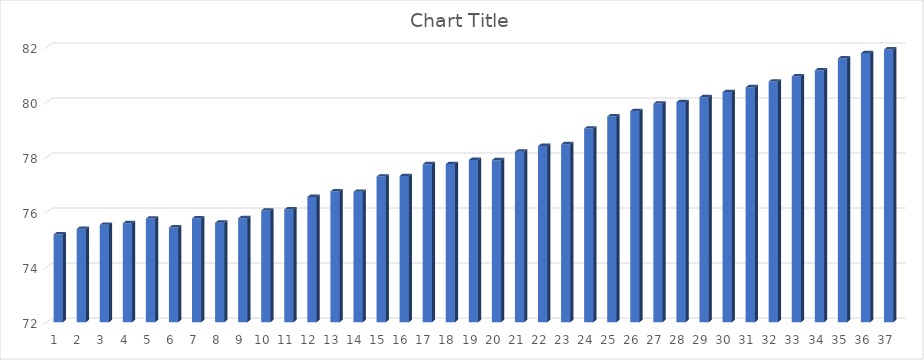
| Category | Series 0 |
|---|---|
| 0 | 75.193 |
| 1 | 75.396 |
| 2 | 75.539 |
| 3 | 75.601 |
| 4 | 75.769 |
| 5 | 75.445 |
| 6 | 75.776 |
| 7 | 75.619 |
| 8 | 75.78 |
| 9 | 76.061 |
| 10 | 76.103 |
| 11 | 76.557 |
| 12 | 76.758 |
| 13 | 76.74 |
| 14 | 77.294 |
| 15 | 77.315 |
| 16 | 77.744 |
| 17 | 77.749 |
| 18 | 77.9 |
| 19 | 77.891 |
| 20 | 78.2 |
| 21 | 78.407 |
| 22 | 78.473 |
| 23 | 79.041 |
| 24 | 79.481 |
| 25 | 79.678 |
| 26 | 79.949 |
| 27 | 80.004 |
| 28 | 80.181 |
| 29 | 80.366 |
| 30 | 80.544 |
| 31 | 80.751 |
| 32 | 80.939 |
| 33 | 81.159 |
| 34 | 81.592 |
| 35 | 81.784 |
| 36 | 81.917 |